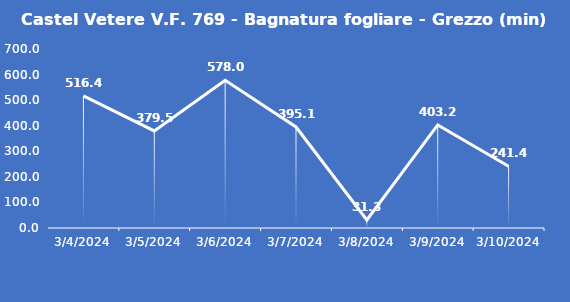
| Category | Castel Vetere V.F. 769 - Bagnatura fogliare - Grezzo (min) |
|---|---|
| 3/4/24 | 516.4 |
| 3/5/24 | 379.5 |
| 3/6/24 | 578 |
| 3/7/24 | 395.1 |
| 3/8/24 | 31.3 |
| 3/9/24 | 403.2 |
| 3/10/24 | 241.4 |